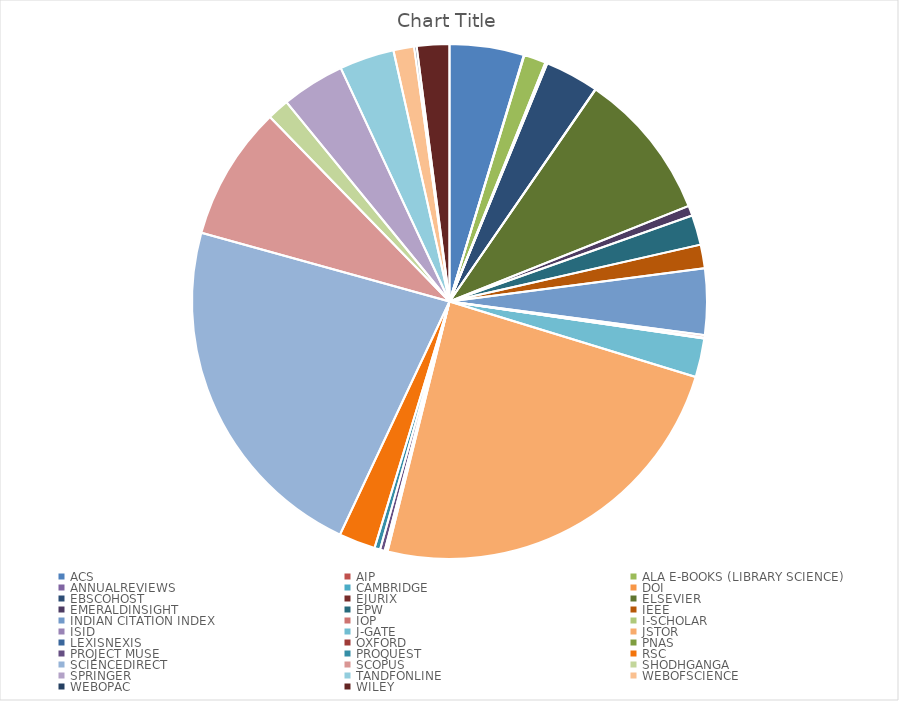
| Category | Series 0 |
|---|---|
| ACS | 1373 |
| AIP | 10 |
| ALA E-BOOKS (LIBRARY SCIENCE) | 406 |
| ANNUALREVIEWS | 20 |
| CAMBRIDGE | 11 |
| DOI | 6 |
| EBSCOHOST | 996 |
| EJURIX | 6 |
| ELSEVIER | 2752 |
| EMERALDINSIGHT | 185 |
| EPW | 553 |
| IEEE | 436 |
| INDIAN CITATION INDEX | 1224 |
| IOP | 44 |
| I-SCHOLAR | 14 |
| ISID | 4 |
| J-GATE | 716 |
| JSTOR | 7107 |
| LEXISNEXIS | 24 |
| OXFORD | 22 |
| PNAS | 8 |
| PROJECT MUSE | 87 |
| PROQUEST | 104 |
| RSC | 675 |
| SCIENCEDIRECT | 6571 |
| SCOPUS | 2478 |
| SHODHGANGA | 403 |
| SPRINGER | 1171 |
| TANDFONLINE | 1013 |
| WEBOFSCIENCE | 382 |
| WEBOPAC | 47 |
| WILEY | 601 |